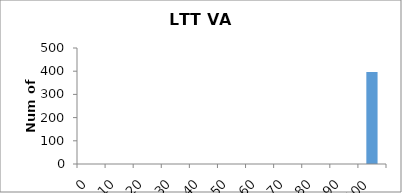
| Category | Series 0 |
|---|---|
| 0.0 | 0 |
| 10.0 | 0 |
| 20.0 | 0 |
| 30.0 | 0 |
| 40.0 | 0 |
| 50.0 | 0 |
| 60.0 | 0 |
| 70.0 | 0 |
| 80.0 | 0 |
| 90.0 | 0 |
| 100.0 | 397 |